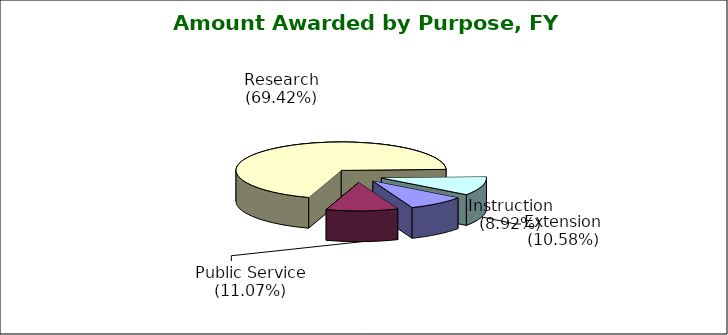
| Category | Series 0 |
|---|---|
| Instruction (8.92%) | 0.089 |
| Public Service (11.07%) | 0.111 |
| Research (69.42%) | 0.694 |
| Extension (10.58%) | 0.106 |